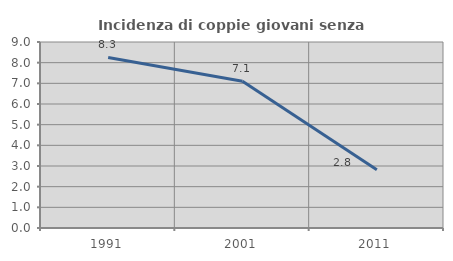
| Category | Incidenza di coppie giovani senza figli |
|---|---|
| 1991.0 | 8.254 |
| 2001.0 | 7.099 |
| 2011.0 | 2.821 |